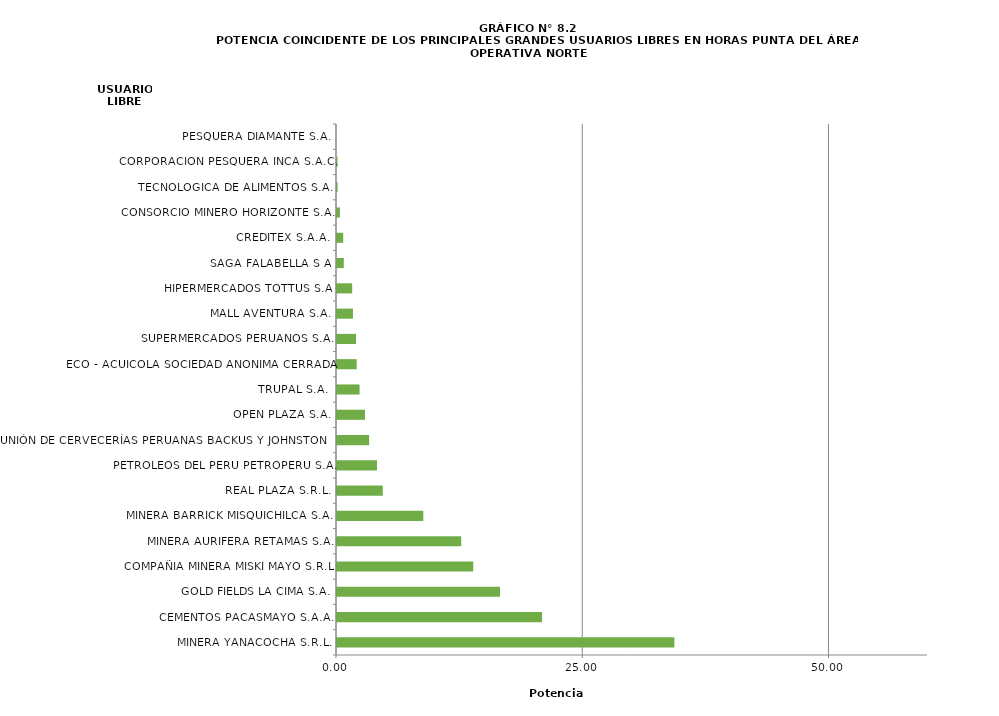
| Category | Series 0 |
|---|---|
| MINERA YANACOCHA S.R.L. | 34.25 |
| CEMENTOS PACASMAYO S.A.A. | 20.82 |
| GOLD FIELDS LA CIMA S.A. | 16.55 |
| COMPAÑIA MINERA MISKI MAYO S.R.L | 13.83 |
| MINERA AURIFERA RETAMAS S.A. | 12.61 |
| MINERA BARRICK MISQUICHILCA S.A. | 8.76 |
| REAL PLAZA S.R.L. | 4.65 |
| PETROLEOS DEL PERU PETROPERU S.A. | 4.06 |
| UNIÓN DE CERVECERÍAS PERUANAS BACKUS Y JOHNSTON S. | 3.26 |
| OPEN PLAZA S.A. | 2.84 |
| TRUPAL S.A. | 2.29 |
| ECO - ACUICOLA SOCIEDAD ANONIMA CERRADA | 2 |
| SUPERMERCADOS PERUANOS S.A. | 1.93 |
| MALL AVENTURA S.A. | 1.62 |
| HIPERMERCADOS TOTTUS S.A | 1.54 |
| SAGA FALABELLA S A | 0.69 |
| CREDITEX S.A.A. | 0.63 |
| CONSORCIO MINERO HORIZONTE S.A. | 0.3 |
| TECNOLOGICA DE ALIMENTOS S.A. | 0.06 |
| CORPORACION PESQUERA INCA S.A.C. | 0.05 |
| PESQUERA DIAMANTE S.A. | 0 |